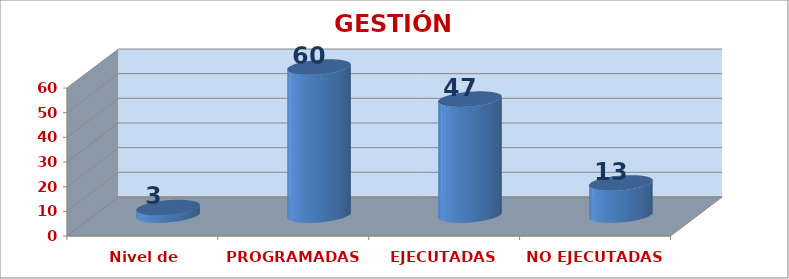
| Category | GESTIÓN ACADÉMICA |
|---|---|
| Nivel de satisfacción | 3 |
| PROGRAMADAS | 60 |
| EJECUTADAS | 47 |
| NO EJECUTADAS | 13 |